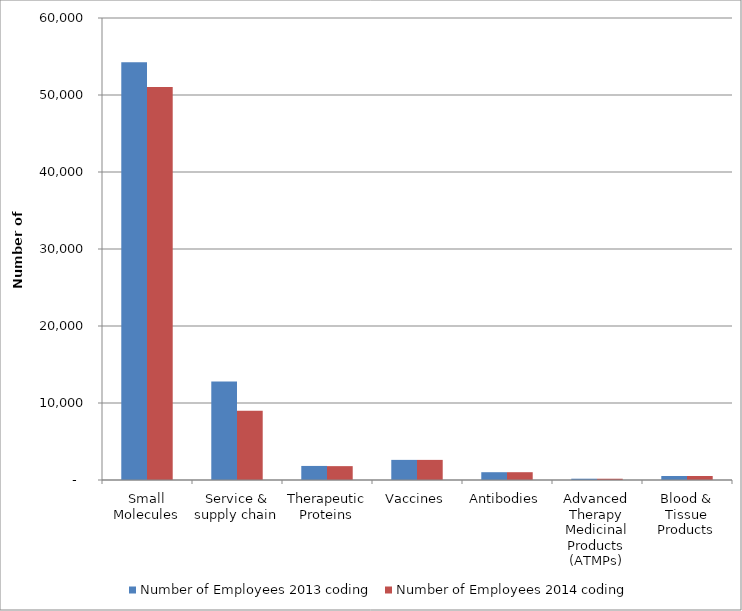
| Category | Number of Employees 2013 coding | Number of Employees 2014 coding |
|---|---|---|
| Small Molecules | 54245 | 51029 |
| Service & supply chain | 12795 | 8978 |
| Therapeutic Proteins | 1826 | 1800 |
| Vaccines | 2613 | 2612 |
| Antibodies | 1012 | 1012 |
| Advanced Therapy Medicinal Products (ATMPs) | 168 | 165 |
| Blood & Tissue Products | 516 | 516 |